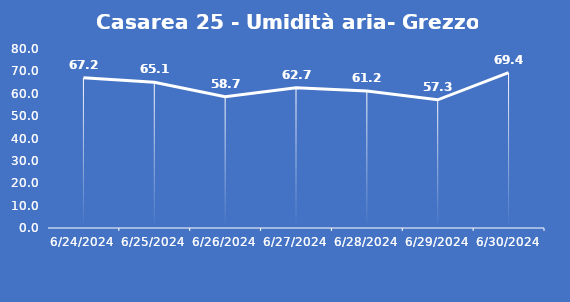
| Category | Casarea 25 - Umidità aria- Grezzo (%) |
|---|---|
| 6/24/24 | 67.2 |
| 6/25/24 | 65.1 |
| 6/26/24 | 58.7 |
| 6/27/24 | 62.7 |
| 6/28/24 | 61.2 |
| 6/29/24 | 57.3 |
| 6/30/24 | 69.4 |